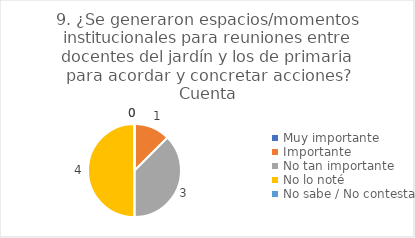
| Category | 9. ¿Se generaron espacios/momentos institucionales para reuniones entre docentes del jardín y los de primaria para acordar y concretar acciones? |
|---|---|
| Muy importante  | 0 |
| Importante  | 0.125 |
| No tan importante  | 0.375 |
| No lo noté  | 0.5 |
| No sabe / No contesta | 0 |